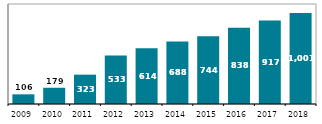
| Category | Celkem v tis. |
|---|---|
| 2009.0 | 106.499 |
| 2010.0 | 178.596 |
| 2011.0 | 322.837 |
| 2012.0 | 533.2 |
| 2013.0 | 613.913 |
| 2014.0 | 688.214 |
| 2015.0 | 744.056 |
| 2016.0 | 837.856 |
| 2017.0 | 917.429 |
| 2018.0 | 1001.125 |